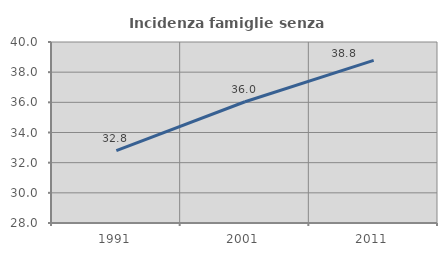
| Category | Incidenza famiglie senza nuclei |
|---|---|
| 1991.0 | 32.798 |
| 2001.0 | 36.039 |
| 2011.0 | 38.786 |